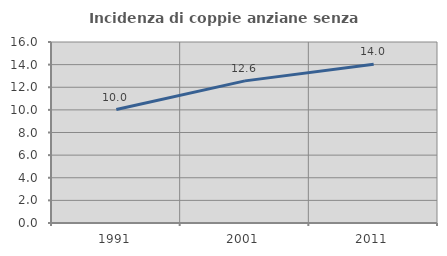
| Category | Incidenza di coppie anziane senza figli  |
|---|---|
| 1991.0 | 10.033 |
| 2001.0 | 12.564 |
| 2011.0 | 14.037 |